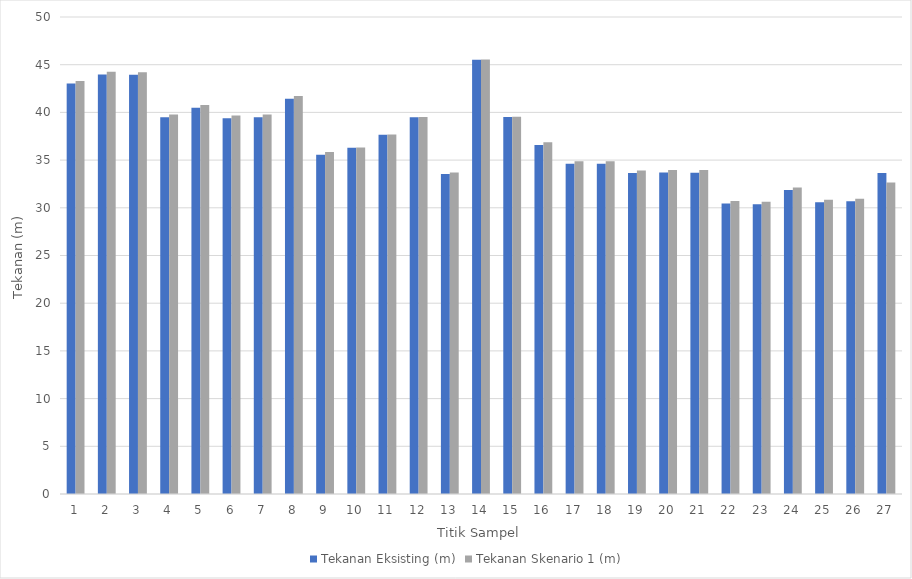
| Category | Tekanan Eksisting (m) | Tekanan Skenario 1 (m) |
|---|---|---|
| 0 | 43.02 | 43.3 |
| 1 | 43.97 | 44.25 |
| 2 | 43.94 | 44.22 |
| 3 | 39.49 | 39.77 |
| 4 | 40.49 | 40.77 |
| 5 | 39.39 | 39.67 |
| 6 | 39.48 | 39.77 |
| 7 | 41.42 | 41.71 |
| 8 | 35.56 | 35.84 |
| 9 | 36.3 | 36.31 |
| 10 | 37.67 | 37.68 |
| 11 | 39.5 | 39.51 |
| 12 | 33.55 | 33.7 |
| 13 | 45.52 | 45.55 |
| 14 | 39.53 | 39.55 |
| 15 | 36.59 | 36.87 |
| 16 | 34.62 | 34.89 |
| 17 | 34.61 | 34.88 |
| 18 | 33.64 | 33.9 |
| 19 | 33.69 | 33.95 |
| 20 | 33.68 | 33.95 |
| 21 | 30.45 | 30.71 |
| 22 | 30.38 | 30.64 |
| 23 | 31.87 | 32.14 |
| 24 | 30.59 | 30.85 |
| 25 | 30.68 | 30.95 |
| 26 | 33.64 | 32.64 |